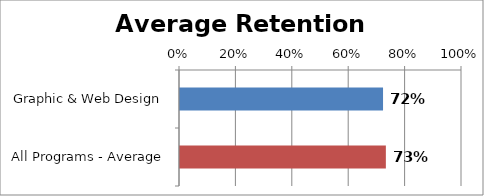
| Category | RetentionRate |
|---|---|
| Graphic & Web Design | 0.72 |
| All Programs - Average | 0.73 |